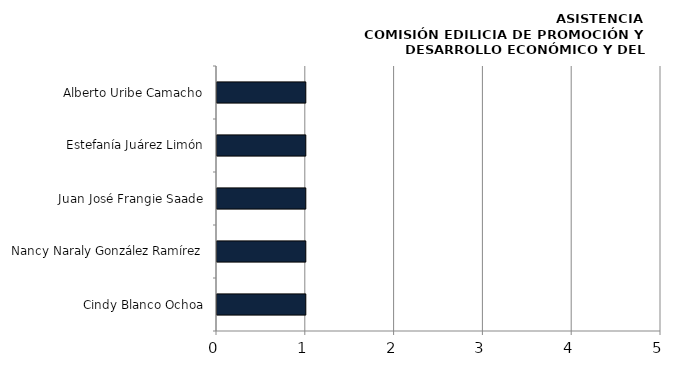
| Category | Series 0 |
|---|---|
| Cindy Blanco Ochoa | 1 |
| Nancy Naraly González Ramírez | 1 |
| Juan José Frangie Saade | 1 |
| Estefanía Juárez Limón | 1 |
| Alberto Uribe Camacho | 1 |